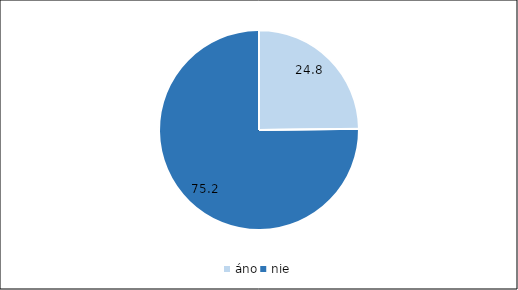
| Category | Predaj |
|---|---|
| áno | 24.8 |
| nie | 75.2 |